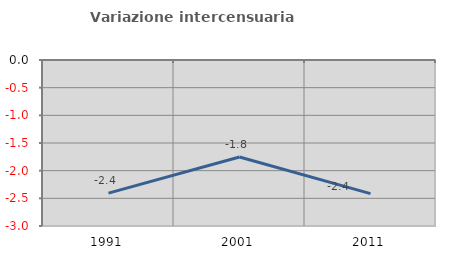
| Category | Variazione intercensuaria annua |
|---|---|
| 1991.0 | -2.406 |
| 2001.0 | -1.753 |
| 2011.0 | -2.415 |